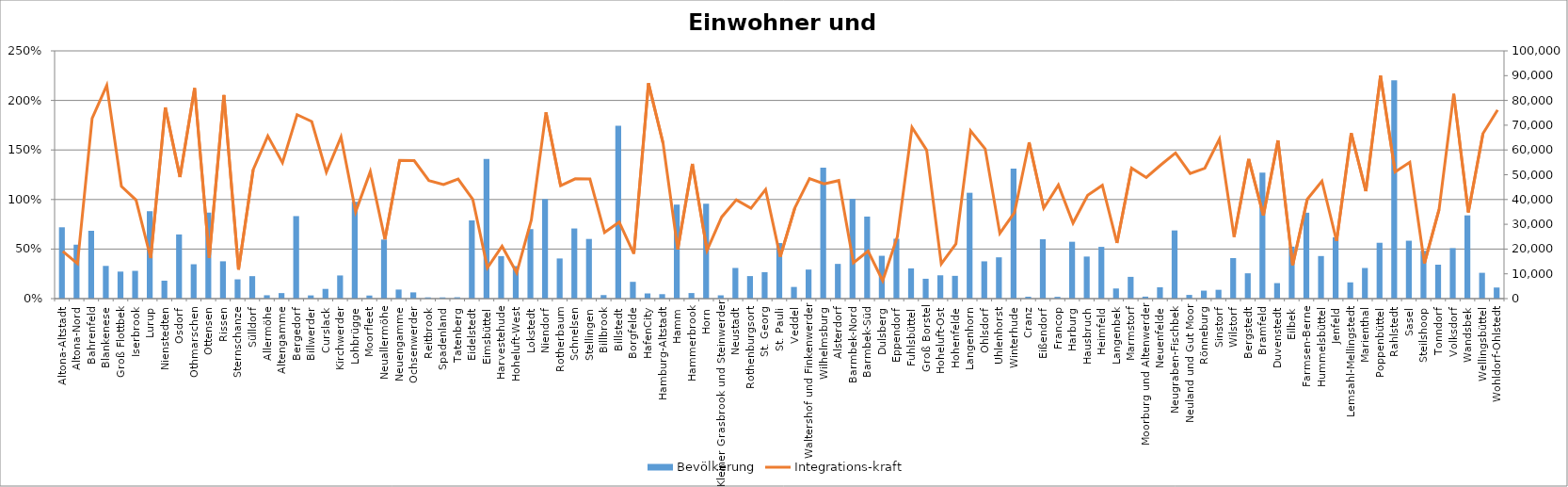
| Category | Bevölkerung |
|---|---|
| Altona-Altstadt | 28788 |
| Altona-Nord | 21766 |
| Bahrenfeld | 27378 |
| Blankenese | 13199 |
| Groß Flottbek | 10904 |
| Iserbrook | 11200 |
| Lurup | 35278 |
| Nienstedten | 7238 |
| Osdorf | 25901 |
| Othmarschen | 13869 |
| Ottensen | 34707 |
| Rissen | 15058 |
| Sternschanze | 7776 |
| Sülldorf | 9067 |
| Allermöhe | 1353 |
| Altengamme | 2227 |
| Bergedorf | 33295 |
| Billwerder | 1294 |
| Curslack | 3920 |
| Kirchwerder | 9341 |
| Lohbrügge | 39074 |
| Moorfleet | 1243 |
| Neuallermöhe | 23841 |
| Neuengamme | 3651 |
| Ochsenwerder | 2512 |
| Reitbrook | 502 |
| Spadenland | 488 |
| Tatenberg | 547 |
| Eidelstedt | 31575 |
| Eimsbüttel | 56359 |
| Harvestehude | 17151 |
| Hoheluft-West | 13120 |
| Lokstedt | 28053 |
| Niendorf | 40171 |
| Rotherbaum | 16200 |
| Schnelsen | 28312 |
| Stellingen | 24077 |
| Billbrook | 1428 |
| Billstedt | 69806 |
| Borgfelde | 6773 |
| HafenCity | 2093 |
| Hamburg-Altstadt | 1793 |
| Hamm | 37948 |
| Hammerbrook | 2244 |
| Horn | 38296 |
| Kleiner Grasbrook und Steinwerder | 1326 |
| Neustadt | 12372 |
| Rothenburgsort | 9092 |
| St. Georg | 10682 |
| St. Pauli | 22433 |
| Veddel | 4707 |
| Waltershof und Finkenwerder | 11721 |
| Wilhelmsburg | 52892 |
| Alsterdorf | 14009 |
| Barmbek-Nord | 40231 |
| Barmbek-Süd | 33116 |
| Dulsberg | 17282 |
| Eppendorf | 24170 |
| Fuhlsbüttel | 12204 |
| Groß Borstel | 8013 |
| Hoheluft-Ost | 9407 |
| Hohenfelde | 9182 |
| Langenhorn | 42714 |
| Ohlsdorf | 15043 |
| Uhlenhorst | 16667 |
| Winterhude | 52441 |
| Cranz | 768 |
| Eißendorf | 23946 |
| Francop | 714 |
| Harburg | 22946 |
| Hausbruch | 16973 |
| Heimfeld | 20874 |
| Langenbek | 4083 |
| Marmstorf | 8780 |
| Moorburg und Altenwerder | 797 |
| Neuenfelde | 4562 |
| Neugraben-Fischbek | 27519 |
| Neuland und Gut Moor | 1490 |
| Rönneburg | 3213 |
| Sinstorf | 3554 |
| Wilstorf | 16350 |
| Bergstedt | 10216 |
| Bramfeld | 50838 |
| Duvenstedt | 6253 |
| Eilbek | 20981 |
| Farmsen-Berne | 34664 |
| Hummelsbüttel | 17180 |
| Jenfeld | 24751 |
| Lemsahl-Mellingstedt | 6556 |
| Marienthal | 12358 |
| Poppenbüttel | 22536 |
| Rahlstedt | 88094 |
| Sasel | 23366 |
| Steilshoop | 19273 |
| Tonndorf | 13691 |
| Volksdorf | 20372 |
| Wandsbek | 33591 |
| Wellingsbüttel | 10415 |
| Wohldorf-Ohlstedt | 4475 |